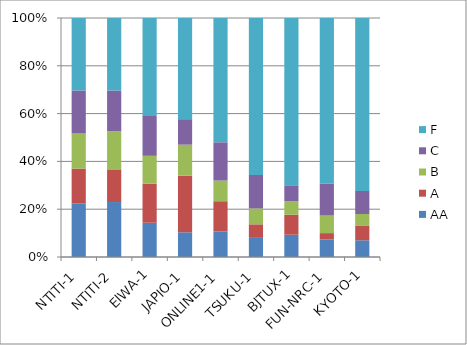
| Category | AA | A | B | C | F |
|---|---|---|---|---|---|
| _x0007_NTITI-1 | 67 | 44 | 44 | 54 | 91 |
| _x0007_NTITI-2 | 69 | 41 | 48 | 51 | 91 |
| _x0006_EIWA-1 | 43 | 49 | 35 | 50 | 123 |
| _x0007_JAPIO-1 | 31 | 71 | 39 | 32 | 127 |
| 	ONLINE1-1 | 32 | 38 | 26 | 48 | 156 |
| _x0007_TSUKU-1 | 25 | 16 | 20 | 42 | 197 |
| _x0007_BJTUX-1 | 28 | 25 | 17 | 20 | 210 |
| 	FUN-NRC-1 | 22 | 8 | 22 | 40 | 208 |
| _x0007_KYOTO-1 | 21 | 18 | 15 | 29 | 217 |